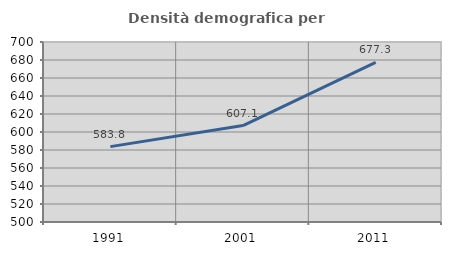
| Category | Densità demografica |
|---|---|
| 1991.0 | 583.752 |
| 2001.0 | 607.144 |
| 2011.0 | 677.32 |